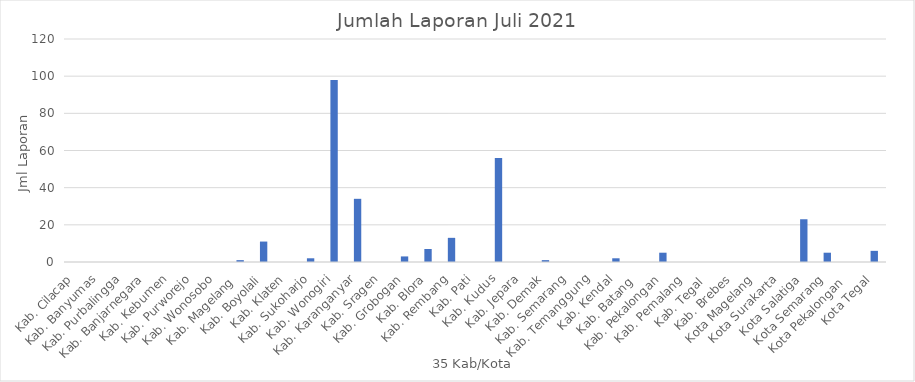
| Category | Series 0 |
|---|---|
| Kab. Cilacap | 0 |
| Kab. Banyumas | 0 |
| Kab. Purbalingga | 0 |
| Kab. Banjarnegara | 0 |
| Kab. Kebumen | 0 |
| Kab. Purworejo | 0 |
| Kab. Wonosobo | 0 |
| Kab. Magelang  | 1 |
| Kab. Boyolali | 11 |
| Kab. Klaten | 0 |
| Kab. Sukoharjo | 2 |
| Kab. Wonogiri | 98 |
| Kab. Karanganyar | 34 |
| Kab. Sragen | 0 |
| Kab. Grobogan | 3 |
| Kab. Blora | 7 |
| Kab. Rembang | 13 |
| Kab. Pati | 0 |
| Kab. Kudus | 56 |
| Kab. Jepara | 0 |
| Kab. Demak | 1 |
| Kab. Semarang | 0 |
| Kab. Temanggung | 0 |
| Kab. Kendal | 2 |
| Kab. Batang  | 0 |
| Kab. Pekalongan | 5 |
| Kab. Pemalang | 0 |
| Kab. Tegal  | 0 |
| Kab. Brebes | 0 |
| Kota Magelang | 0 |
| Kota Surakarta | 0 |
| Kota Salatiga | 23 |
| Kota Semarang | 5 |
| Kota Pekalongan  | 0 |
| Kota Tegal | 6 |